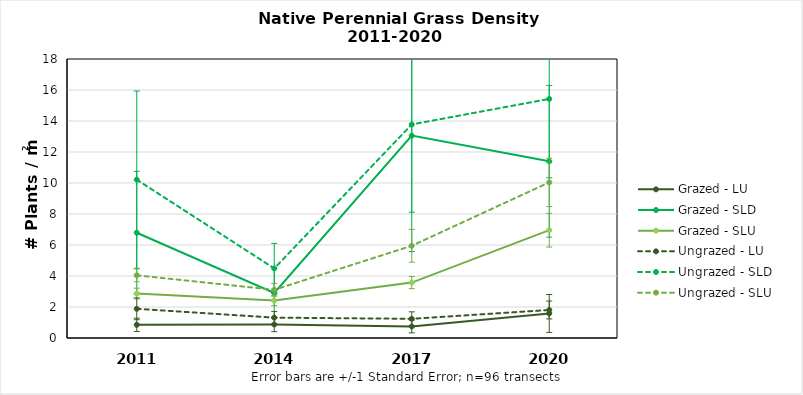
| Category | Grazed - LU | Grazed - SLD | Grazed - SLU | Ungrazed - LU | Ungrazed - SLD | Ungrazed - SLU |
|---|---|---|---|---|---|---|
| 2011.0 | 0.85 | 6.792 | 2.865 | 1.884 | 10.215 | 4.045 |
| 2014.0 | 0.872 | 2.906 | 2.42 | 1.313 | 4.489 | 3.109 |
| 2017.0 | 0.743 | 13.057 | 3.575 | 1.238 | 13.778 | 5.951 |
| 2020.0 | 1.582 | 11.399 | 6.957 | 1.808 | 15.425 | 10.039 |